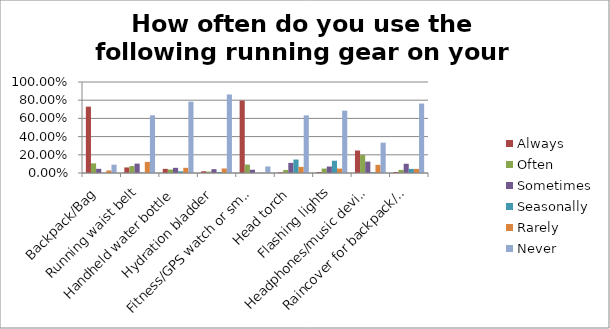
| Category | Always | Often | Sometimes | Seasonally | Rarely | Never |
|---|---|---|---|---|---|---|
| Backpack/Bag | 0.729 | 0.106 | 0.046 | 0 | 0.028 | 0.092 |
| Running waist belt | 0.061 | 0.076 | 0.103 | 0.004 | 0.122 | 0.634 |
| Handheld water bottle | 0.046 | 0.038 | 0.057 | 0.019 | 0.057 | 0.784 |
| Hydration bladder | 0.019 | 0.015 | 0.042 | 0.012 | 0.05 | 0.863 |
| Fitness/GPS watch or smartphone app | 0.796 | 0.093 | 0.036 | 0 | 0.004 | 0.071 |
| Head torch | 0.007 | 0.033 | 0.111 | 0.148 | 0.067 | 0.633 |
| Flashing lights | 0.011 | 0.049 | 0.071 | 0.135 | 0.049 | 0.685 |
| Headphones/music device | 0.247 | 0.197 | 0.125 | 0.007 | 0.09 | 0.333 |
| Raincover for backpack/bag | 0.011 | 0.034 | 0.102 | 0.045 | 0.045 | 0.763 |